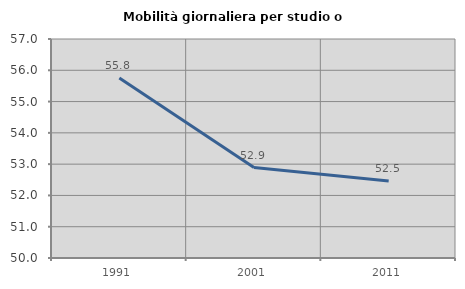
| Category | Mobilità giornaliera per studio o lavoro |
|---|---|
| 1991.0 | 55.756 |
| 2001.0 | 52.893 |
| 2011.0 | 52.459 |